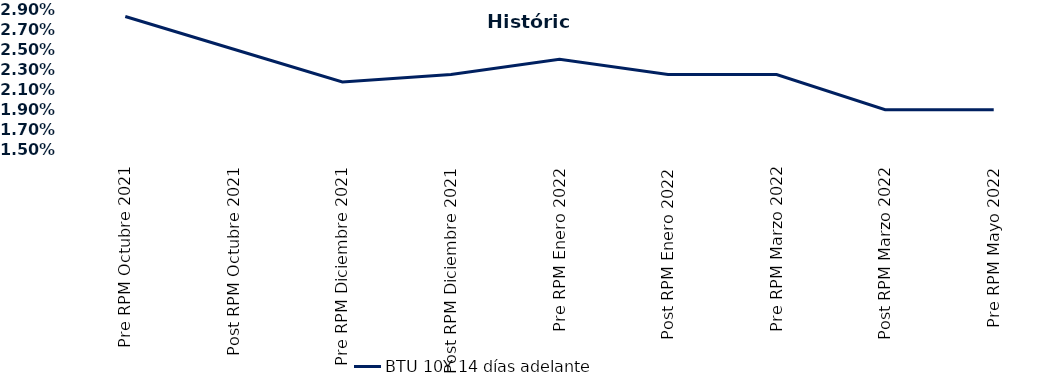
| Category | BTU 10Y 14 días adelante |
|---|---|
| Pre RPM Octubre 2021 | 0.028 |
| Post RPM Octubre 2021 | 0.025 |
| Pre RPM Diciembre 2021 | 0.022 |
| Post RPM Diciembre 2021 | 0.022 |
| Pre RPM Enero 2022 | 0.024 |
| Post RPM Enero 2022 | 0.022 |
| Pre RPM Marzo 2022 | 0.022 |
| Post RPM Marzo 2022 | 0.019 |
| Pre RPM Mayo 2022 | 0.019 |